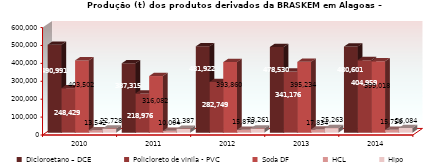
| Category | Dicloroetano – DCE | Policloreto de vinila - PVC | Soda DF | HCL | Hipo |
|---|---|---|---|---|---|
| 2010.0 | 490991 | 248429 | 403502 | 13542 | 22728 |
| 2011.0 | 387315 | 218976 | 316082 | 10004 | 21387 |
| 2012.0 | 481922 | 282749 | 393860 | 15878 | 23261 |
| 2013.0 | 478529.886 | 341175.758 | 395234.419 | 17834.023 | 25262.745 |
| 2014.0 | 480601.332 | 404959.409 | 399017.585 | 15755.725 | 26084.171 |